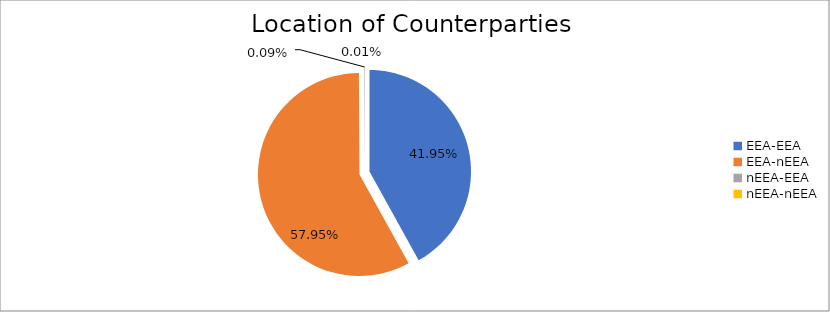
| Category | Series 0 |
|---|---|
| EEA-EEA | 4085218.595 |
| EEA-nEEA | 5642861.028 |
| nEEA-EEA | 8774.826 |
| nEEA-nEEA | 533.522 |